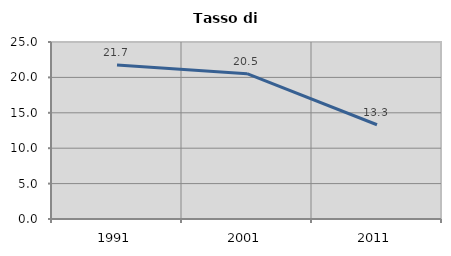
| Category | Tasso di disoccupazione   |
|---|---|
| 1991.0 | 21.739 |
| 2001.0 | 20.521 |
| 2011.0 | 13.309 |